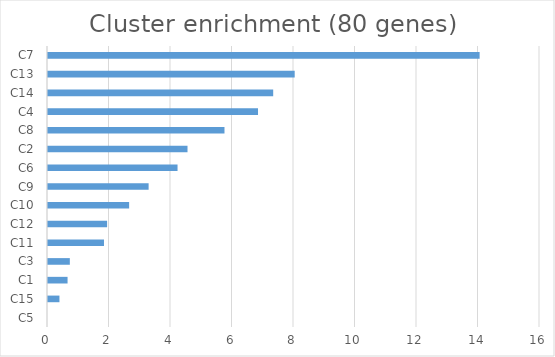
| Category | minus log10(q) |
|---|---|
| C5 | 0 |
| C15 | 0.372 |
| C1 | 0.636 |
| C3 | 0.71 |
| C11 | 1.821 |
| C12 | 1.922 |
| C10 | 2.638 |
| C9 | 3.272 |
| C6 | 4.213 |
| C2 | 4.537 |
| C8 | 5.739 |
| C4 | 6.83 |
| C14 | 7.323 |
| C13 | 8.023 |
| C7 | 14.036 |